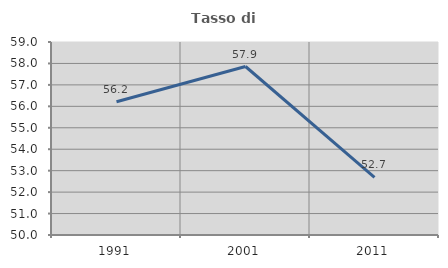
| Category | Tasso di occupazione   |
|---|---|
| 1991.0 | 56.216 |
| 2001.0 | 57.857 |
| 2011.0 | 52.685 |